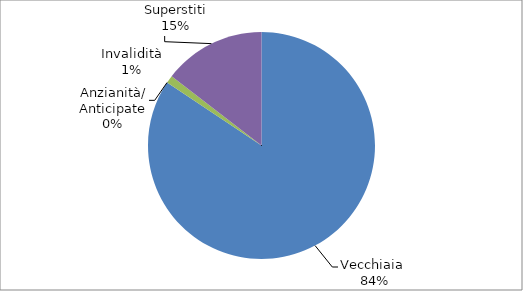
| Category | Series 0 |
|---|---|
| Vecchiaia  | 6481 |
| Anzianità/ Anticipate | 0 |
| Invalidità | 85 |
| Superstiti | 1117 |